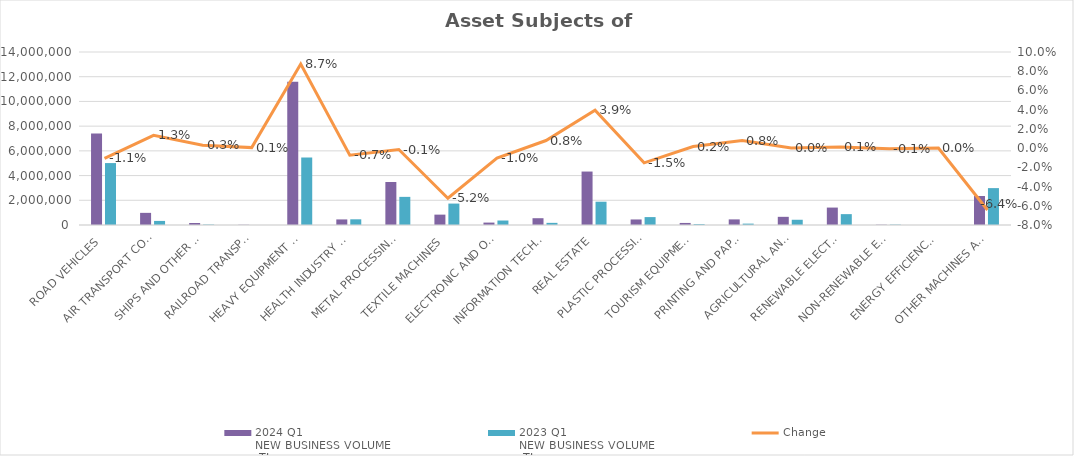
| Category | 2024 Q1 
NEW BUSINESS VOLUME
 TL | 2023 Q1 
NEW BUSINESS VOLUME
 TL |
|---|---|---|
| ROAD VEHICLES | 7397294.563 | 5011089.681 |
| AIR TRANSPORT CONVEYANCE | 982366 | 330000 |
| SHIPS AND OTHER SEA-GOING VESSELS | 163468.28 | 37098.982 |
| RAILROAD TRANSPORT VEHICLES | 18254 | 0 |
| HEAVY EQUIPMENT AND CONSTRUCTION MACHINERY | 11582396.451 | 5462261.128 |
| HEALTH INDUSTRY AND AESTHETIC INSTRUMENTS | 451262.694 | 460659.256 |
| METAL PROCESSING MACHINE | 3481190.423 | 2276551.444 |
| TEXTILE MACHINES | 839201.018 | 1733707.016 |
| ELECTRONIC AND OPTICAL DEVICES | 195343.264 | 362848.208 |
| INFORMATION TECHNOLOGIES AND OFFICE SYSTEMS | 549416.413 | 173431.507 |
| REAL ESTATE | 4325579.148 | 1884908.358 |
| PLASTIC PROCESSING MACHINES | 448558.895 | 640082.712 |
| TOURISM EQUIPMENT | 166575.623 | 69297.365 |
| PRINTING AND PAPER PROCESSING MACHINES | 453692.902 | 111359.098 |
| AGRICULTURAL AND LIVESTOCK FARMING MACHINES | 661256.739 | 423913.835 |
| RENEWABLE ELECTRICITY GENERATION | 1410244.217 | 879491.735 |
| NON-RENEWABLE ELECTRIC ENERGY GENERATION | 23822 | 29859 |
| ENERGY EFFICIENCY EQUIPMENT | 0 | 0 |
| OTHER MACHINES AND EQUIPMENT | 2345405.061 | 2985144.813 |